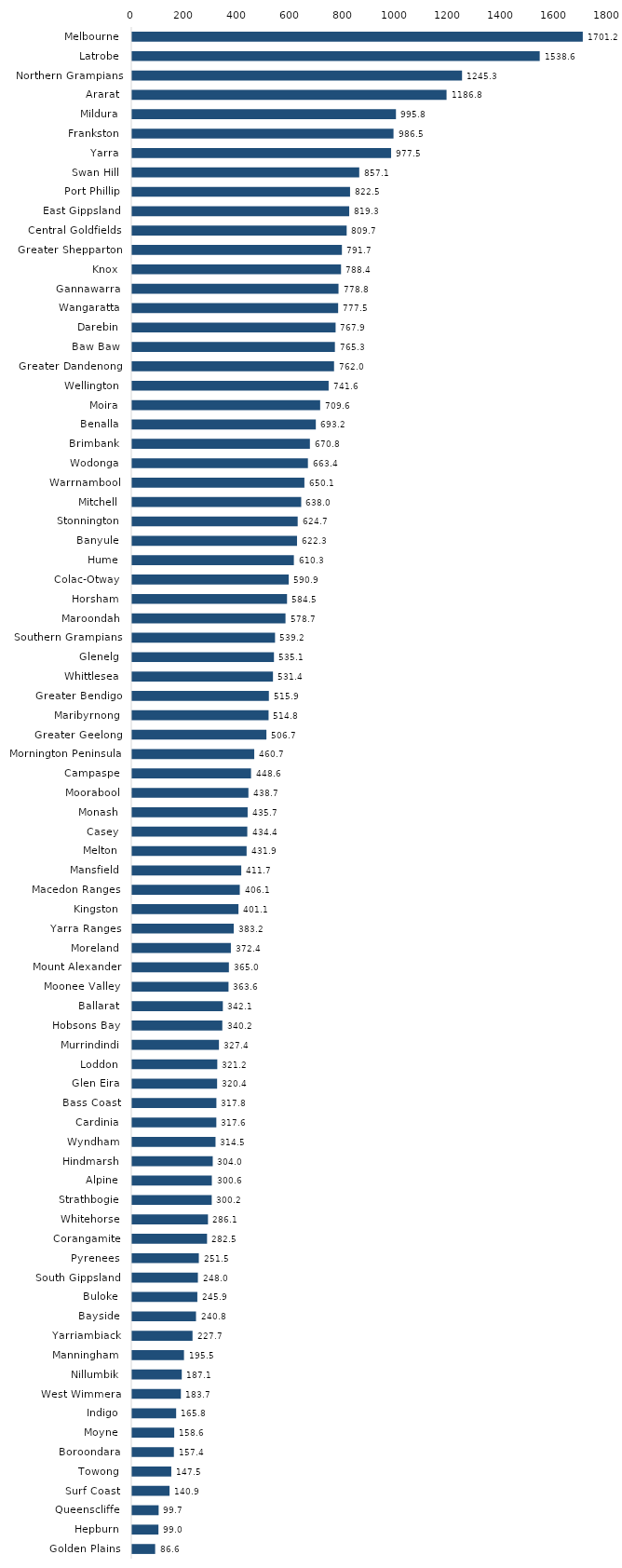
| Category | Series 0 |
|---|---|
| Melbourne  | 1701.169 |
| Latrobe  | 1538.563 |
| Northern Grampians  | 1245.286 |
| Ararat  | 1186.795 |
| Mildura  | 995.763 |
| Frankston  | 986.48 |
| Yarra  | 977.455 |
| Swan Hill  | 857.115 |
| Port Phillip  | 822.487 |
| East Gippsland  | 819.277 |
| Central Goldfields  | 809.655 |
| Greater Shepparton  | 791.71 |
| Knox  | 788.389 |
| Gannawarra  | 778.846 |
| Wangaratta  | 777.477 |
| Darebin  | 767.89 |
| Baw Baw  | 765.25 |
| Greater Dandenong  | 762.048 |
| Wellington  | 741.568 |
| Moira  | 709.574 |
| Benalla  | 693.216 |
| Brimbank  | 670.838 |
| Wodonga  | 663.354 |
| Warrnambool  | 650.1 |
| Mitchell  | 638.025 |
| Stonnington  | 624.715 |
| Banyule  | 622.253 |
| Hume  | 610.312 |
| Colac-Otway  | 590.897 |
| Horsham  | 584.474 |
| Maroondah  | 578.722 |
| Southern Grampians  | 539.234 |
| Glenelg  | 535.141 |
| Whittlesea  | 531.413 |
| Greater Bendigo  | 515.919 |
| Maribyrnong  | 514.834 |
| Greater Geelong  | 506.671 |
| Mornington Peninsula  | 460.731 |
| Campaspe  | 448.573 |
| Moorabool  | 438.73 |
| Monash  | 435.746 |
| Casey  | 434.449 |
| Melton  | 431.884 |
| Mansfield  | 411.653 |
| Macedon Ranges  | 406.113 |
| Kingston  | 401.093 |
| Yarra Ranges  | 383.233 |
| Moreland  | 372.427 |
| Mount Alexander  | 364.982 |
| Moonee Valley  | 363.559 |
| Ballarat  | 342.131 |
| Hobsons Bay  | 340.16 |
| Murrindindi  | 327.399 |
| Loddon  | 321.156 |
| Glen Eira  | 320.448 |
| Bass Coast  | 317.799 |
| Cardinia  | 317.575 |
| Wyndham  | 314.514 |
| Hindmarsh  | 304.006 |
| Alpine  | 300.624 |
| Strathbogie  | 300.218 |
| Whitehorse  | 286.054 |
| Corangamite  | 282.504 |
| Pyrenees  | 251.489 |
| South Gippsland  | 247.95 |
| Buloke  | 245.861 |
| Bayside  | 240.838 |
| Yarriambiack  | 227.687 |
| Manningham  | 195.456 |
| Nillumbik  | 187.062 |
| West Wimmera  | 183.727 |
| Indigo  | 165.828 |
| Moyne  | 158.572 |
| Boroondara  | 157.357 |
| Towong  | 147.493 |
| Surf Coast  | 140.922 |
| Queenscliffe  | 99.734 |
| Hepburn  | 99.028 |
| Golden Plains  | 86.602 |